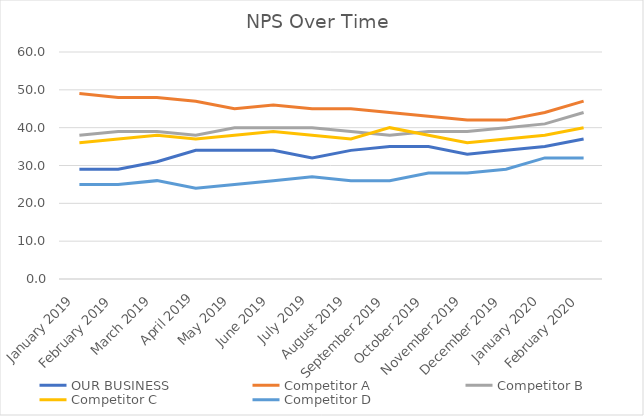
| Category | OUR BUSINESS | Competitor A | Competitor B | Competitor C | Competitor D |
|---|---|---|---|---|---|
| January 2019 | 29 | 49 | 38 | 36 | 25 |
| February 2019 | 29 | 48 | 39 | 37 | 25 |
| March 2019 | 31 | 48 | 39 | 38 | 26 |
| April 2019 | 34 | 47 | 38 | 37 | 24 |
| May 2019 | 34 | 45 | 40 | 38 | 25 |
| June 2019 | 34 | 46 | 40 | 39 | 26 |
| July 2019 | 32 | 45 | 40 | 38 | 27 |
| August 2019 | 34 | 45 | 39 | 37 | 26 |
| September 2019 | 35 | 44 | 38 | 40 | 26 |
| October 2019 | 35 | 43 | 39 | 38 | 28 |
| November 2019 | 33 | 42 | 39 | 36 | 28 |
| December 2019 | 34 | 42 | 40 | 37 | 29 |
| January 2020 | 35 | 44 | 41 | 38 | 32 |
| February 2020 | 37 | 47 | 44 | 40 | 32 |